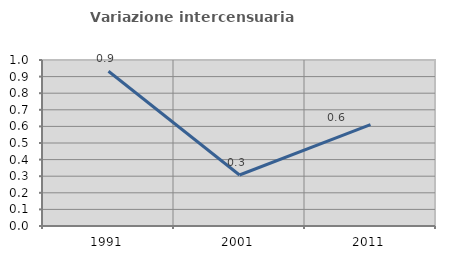
| Category | Variazione intercensuaria annua |
|---|---|
| 1991.0 | 0.932 |
| 2001.0 | 0.307 |
| 2011.0 | 0.611 |